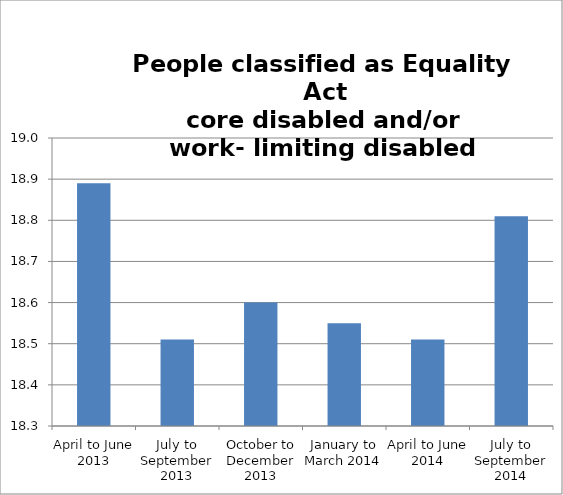
| Category | Series 0 |
|---|---|
| April to June 2013 | 18.89 |
| July to September 2013 | 18.51 |
| October to December 2013 | 18.6 |
| January to March 2014 | 18.55 |
| April to June 2014 | 18.51 |
| July to September 2014 | 18.81 |